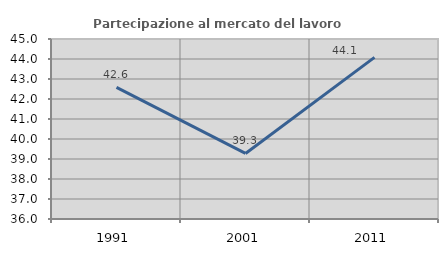
| Category | Partecipazione al mercato del lavoro  femminile |
|---|---|
| 1991.0 | 42.585 |
| 2001.0 | 39.278 |
| 2011.0 | 44.084 |